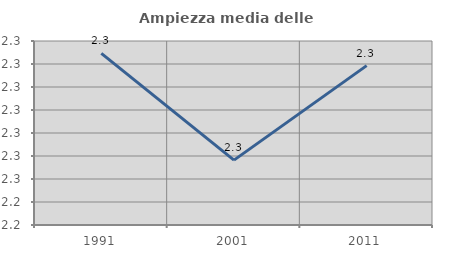
| Category | Ampiezza media delle famiglie |
|---|---|
| 1991.0 | 2.277 |
| 2001.0 | 2.254 |
| 2011.0 | 2.275 |